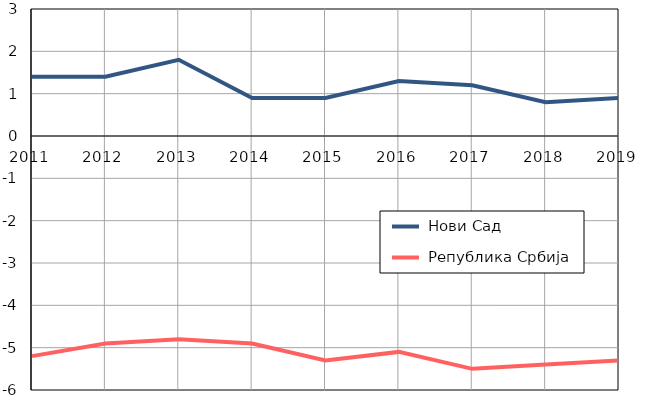
| Category |  Нови Сад |  Република Србија |
|---|---|---|
| 2011.0 | 1.4 | -5.2 |
| 2012.0 | 1.4 | -4.9 |
| 2013.0 | 1.8 | -4.8 |
| 2014.0 | 0.9 | -4.9 |
| 2015.0 | 0.9 | -5.3 |
| 2016.0 | 1.3 | -5.1 |
| 2017.0 | 1.2 | -5.5 |
| 2018.0 | 0.8 | -5.4 |
| 2019.0 | 0.9 | -5.3 |